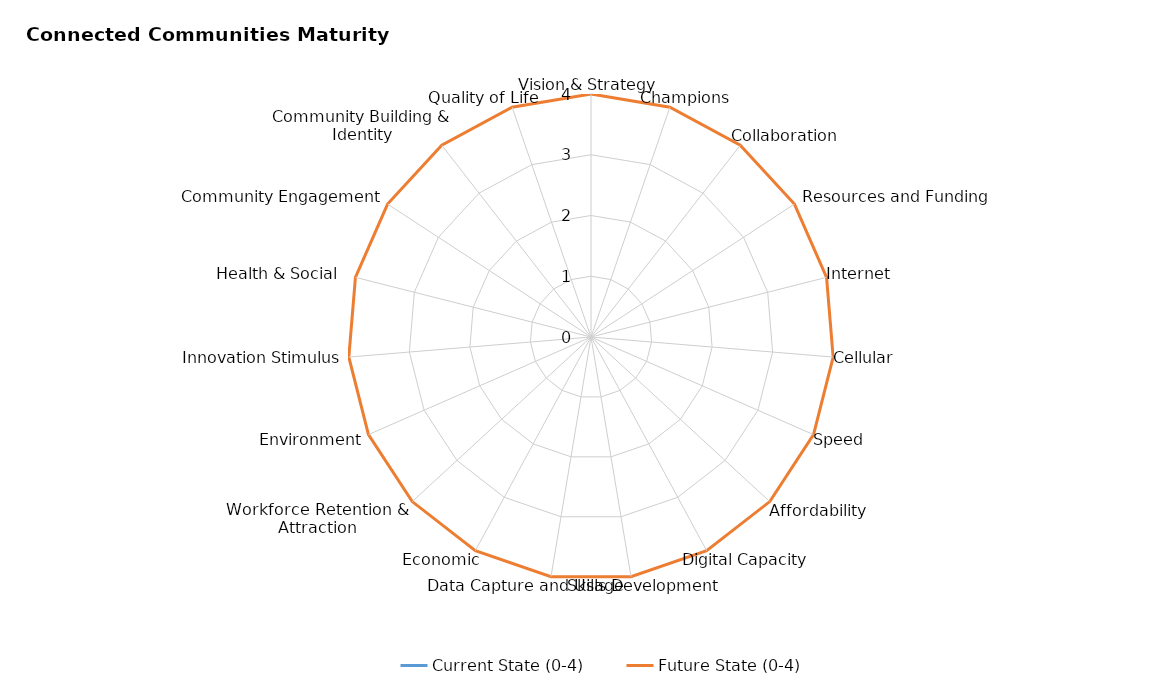
| Category | Current State (0-4) | Future State (0-4) |
|---|---|---|
| Vision & Strategy | 0 | 4 |
| Champions  | 0 | 4 |
| Collaboration | 0 | 4 |
| Resources and Funding
 | 0 | 4 |
| Internet | 0 | 4 |
| Cellular | 0 | 4 |
| Speed | 0 | 4 |
| Affordability                           | 0 | 4 |
| Digital Capacity | 0 | 4 |
| Skills Development | 0 | 4 |
| Data Capture and Usage | 0 | 4 |
| Economic  | 0 | 4 |
| Workforce Retention & Attraction | 0 | 4 |
| Environment | 0 | 4 |
| Innovation Stimulus | 0 | 4 |
| Health & Social   | 0 | 4 |
| Community Engagement | 0 | 4 |
| Community Building & Identity | 0 | 4 |
| Quality of Life | 0 | 4 |